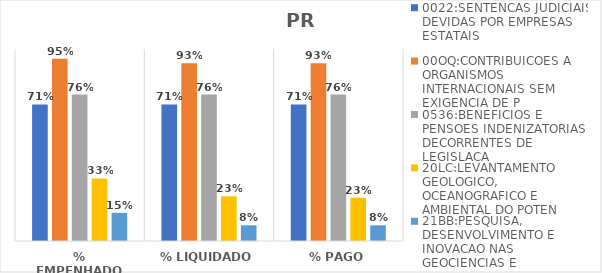
| Category | 0022:SENTENCAS JUDICIAIS DEVIDAS POR EMPRESAS ESTATAIS | 00OQ:CONTRIBUICOES A ORGANISMOS INTERNACIONAIS SEM EXIGENCIA DE P | 0536:BENEFICIOS E PENSOES INDENIZATORIAS DECORRENTES DE LEGISLACA | 20LC:LEVANTAMENTO GEOLOGICO, OCEANOGRAFICO E AMBIENTAL DO POTEN | 21BB:PESQUISA, DESENVOLVIMENTO E INOVACAO NAS GEOCIENCIAS E |
|---|---|---|---|---|---|
| % EMPENHADO | 0.711 | 0.95 | 0.763 | 0.326 | 0.147 |
| % LIQUIDADO | 0.711 | 0.926 | 0.763 | 0.233 | 0.082 |
| % PAGO | 0.711 | 0.926 | 0.763 | 0.226 | 0.082 |